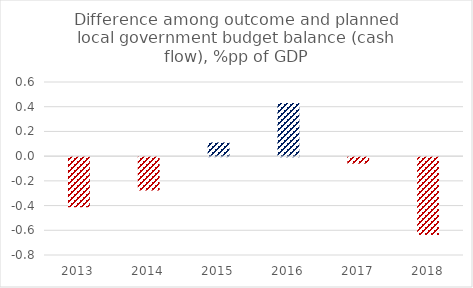
| Category | Series 0 |
|---|---|
| 2013.0 | -0.405 |
| 2014.0 | -0.27 |
| 2015.0 | 0.111 |
| 2016.0 | 0.431 |
| 2017.0 | -0.053 |
| 2018.0 | -0.63 |